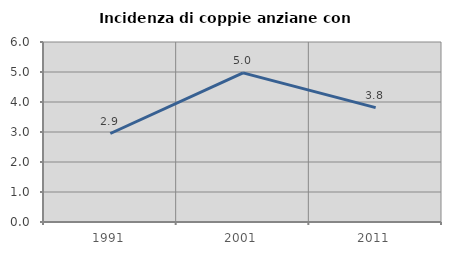
| Category | Incidenza di coppie anziane con figli |
|---|---|
| 1991.0 | 2.95 |
| 2001.0 | 4.972 |
| 2011.0 | 3.812 |